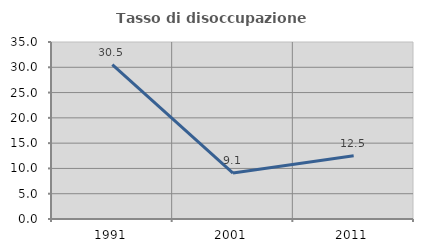
| Category | Tasso di disoccupazione giovanile  |
|---|---|
| 1991.0 | 30.508 |
| 2001.0 | 9.091 |
| 2011.0 | 12.5 |